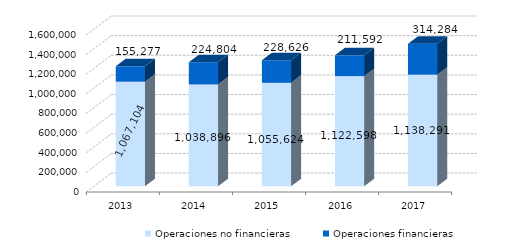
| Category | Operaciones no financieras | Operaciones financieras |
|---|---|---|
| 2013.0 | 1067104 | 155277 |
| 2014.0 | 1038896 | 224804 |
| 2015.0 | 1055624 | 228626 |
| 2016.0 | 1122597.53 | 211592.47 |
| 2017.0 | 1138290.67 | 314284.33 |